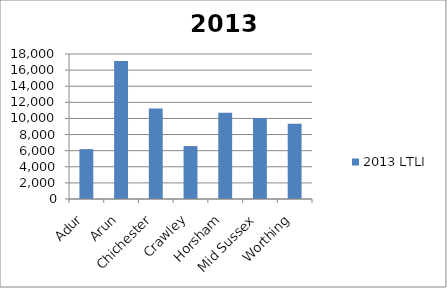
| Category | 2013 LTLI |
|---|---|
| Adur  | 6186 |
| Arun | 17128 |
| Chichester | 11221 |
| Crawley | 6571 |
| Horsham | 10713 |
| Mid Sussex | 10070 |
| Worthing | 9329 |